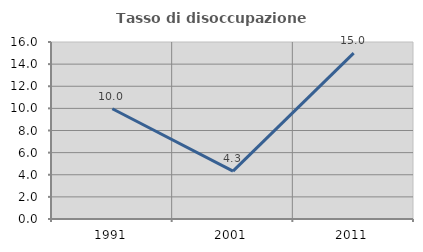
| Category | Tasso di disoccupazione giovanile  |
|---|---|
| 1991.0 | 9.967 |
| 2001.0 | 4.324 |
| 2011.0 | 15 |